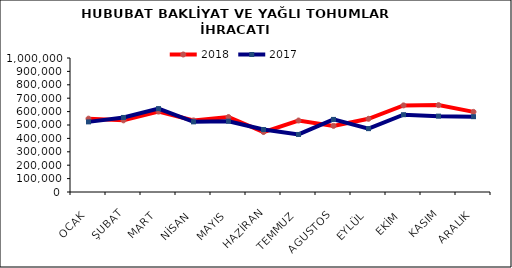
| Category | 2018 | 2017 |
|---|---|---|
| OCAK | 547282.777 | 523301.514 |
| ŞUBAT | 534707.375 | 556349.956 |
| MART | 599959.42 | 622260.372 |
| NİSAN | 534080.271 | 523468.588 |
| MAYIS | 559519.072 | 528447.99 |
| HAZİRAN | 447489.812 | 466088.372 |
| TEMMUZ | 533503.877 | 429421.154 |
| AGUSTOS | 493360.056 | 541679.695 |
| EYLÜL | 546299.05 | 472874.206 |
| EKİM | 646284.856 | 576909.779 |
| KASIM | 648488.325 | 566189.522 |
| ARALIK | 597888.503 | 562187.326 |